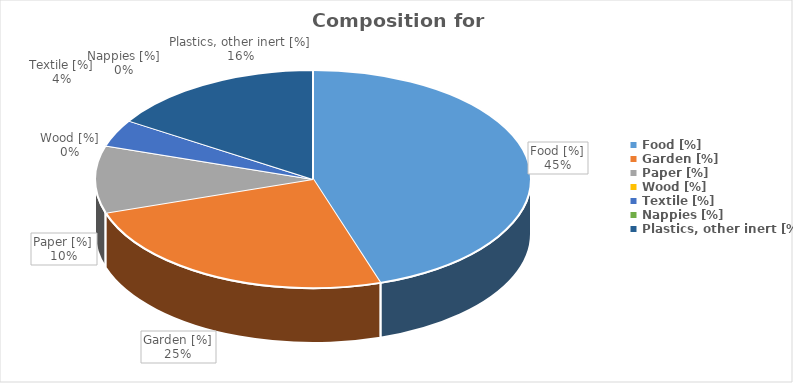
| Category | Series 0 |
|---|---|
| Food [%] | 45 |
| Garden [%] | 25 |
| Paper [%] | 10 |
| Wood [%] | 0 |
| Textile [%] | 4 |
| Nappies [%] | 0 |
| Plastics, other inert [%] | 16 |